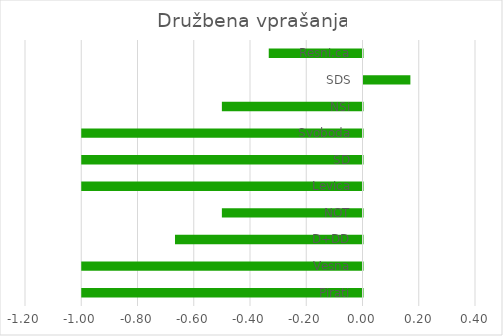
| Category | Series 0 |
|---|---|
| Pirati | -1 |
| Vesna | -1 |
| D+DD | -0.667 |
| NOT | -0.5 |
| Levica | -1 |
| SD | -1 |
| Svoboda | -1 |
| NSi | -0.5 |
| SDS | 0.167 |
| Resni.ca | -0.333 |